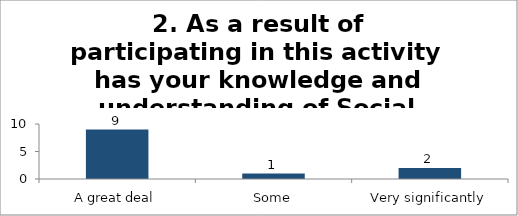
| Category | 2. As a result of participating in this activity has your knowledge and understanding of Social Entrepreneurship developed? |
|---|---|
| A great deal | 9 |
| Some | 1 |
| Very significantly | 2 |